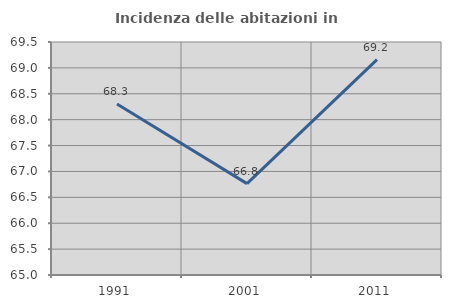
| Category | Incidenza delle abitazioni in proprietà  |
|---|---|
| 1991.0 | 68.302 |
| 2001.0 | 66.765 |
| 2011.0 | 69.161 |